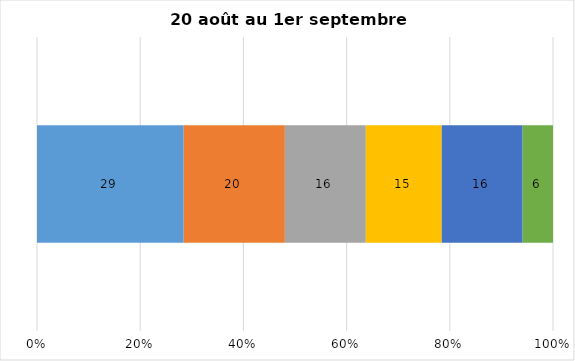
| Category | Plusieurs fois par jour | Une fois par jour | Quelques fois par semaine   | Une fois par semaine ou moins   |  Jamais   |  Je n’utilise pas les médias sociaux |
|---|---|---|---|---|---|---|
| 0 | 29 | 20 | 16 | 15 | 16 | 6 |